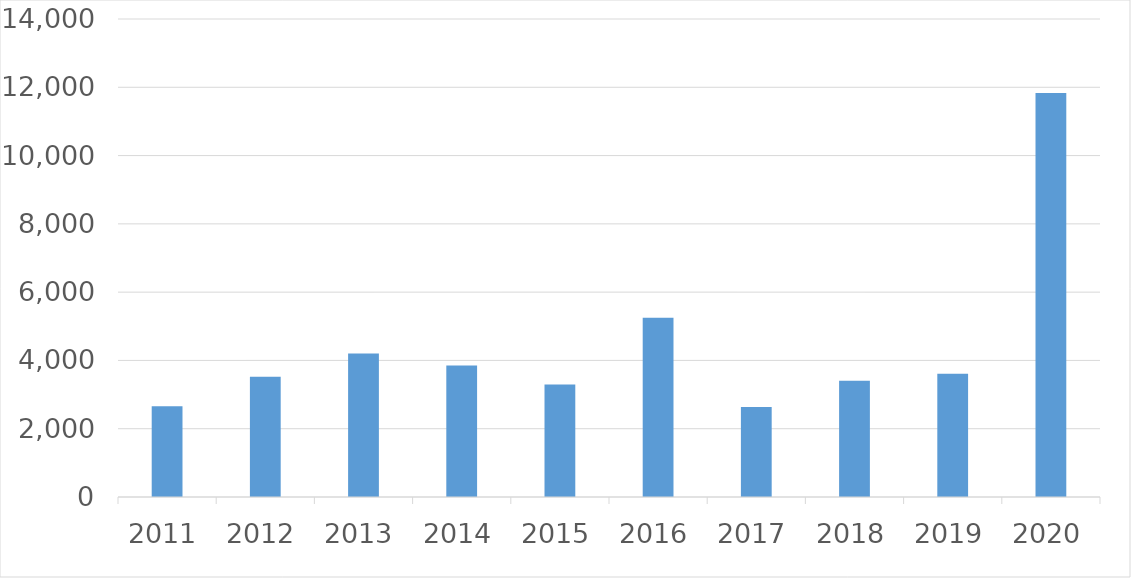
| Category | Series 0 |
|---|---|
| 2011 | 2656 |
| 2012 | 3524 |
| 2013 | 4200 |
| 2014 | 3849 |
| 2015 | 3294 |
| 2016 | 5249 |
| 2017 | 2636 |
| 2018 | 3406 |
| 2019 | 3611 |
| 2020 | 11835 |